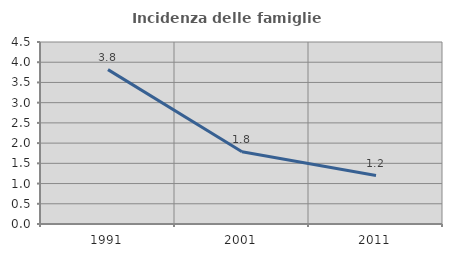
| Category | Incidenza delle famiglie numerose |
|---|---|
| 1991.0 | 3.817 |
| 2001.0 | 1.788 |
| 2011.0 | 1.197 |